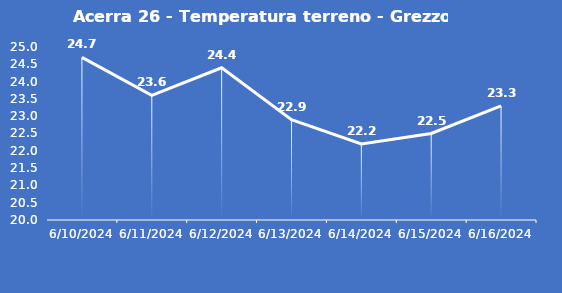
| Category | Acerra 26 - Temperatura terreno - Grezzo (°C) |
|---|---|
| 6/10/24 | 24.7 |
| 6/11/24 | 23.6 |
| 6/12/24 | 24.4 |
| 6/13/24 | 22.9 |
| 6/14/24 | 22.2 |
| 6/15/24 | 22.5 |
| 6/16/24 | 23.3 |